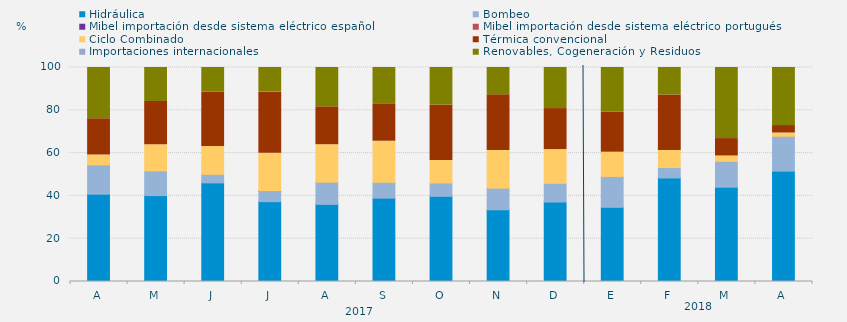
| Category | Hidráulica | Bombeo | Mibel importación desde sistema eléctrico español | Mibel importación desde sistema eléctrico portugués | Ciclo Combinado | Térmica convencional | Importaciones internacionales | Renovables, Cogeneración y Residuos |
|---|---|---|---|---|---|---|---|---|
| A | 40.799 | 13.738 | 0 | 0 | 4.583 | 16.933 | 0 | 23.947 |
| M | 40.143 | 11.559 | 0 | 0 | 12.186 | 20.228 | 0 | 15.883 |
| J | 46.088 | 3.981 | 0 | 0 | 13.032 | 25.463 | 0 | 11.435 |
| J | 37.298 | 4.783 | 0 | 0.134 | 17.675 | 28.595 | 0 | 11.514 |
| A | 36.044 | 10.361 | 0 | 0 | 17.518 | 17.708 | 0 | 18.369 |
| S | 38.947 | 7.407 | 0 | 0 | 19.201 | 17.187 | 0 | 17.257 |
| O | 39.807 | 6.25 | 0 | 0 | 10.484 | 25.963 | 0 | 17.496 |
| N | 33.519 | 10.116 | 0 | 0 | 17.546 | 26.088 | 0 | 12.731 |
| D | 37.142 | 8.737 | 0 | 0 | 15.771 | 19.153 | 0 | 19.198 |
| E | 34.655 | 14.449 | 0 | 0 | 11.313 | 18.638 | 0 | 20.945 |
| F | 48.388 | 4.836 | 0 | 0 | 7.961 | 25.992 | 0 | 12.822 |
| M | 44.056 | 12.113 | 0 | 0 | 2.49 | 8.12 | 0 | 33.221 |
| A | 51.574 | 16.296 | 0 | 0 | 1.528 | 3.472 | 0 | 27.13 |